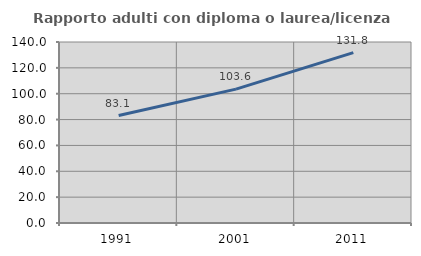
| Category | Rapporto adulti con diploma o laurea/licenza media  |
|---|---|
| 1991.0 | 83.134 |
| 2001.0 | 103.57 |
| 2011.0 | 131.798 |